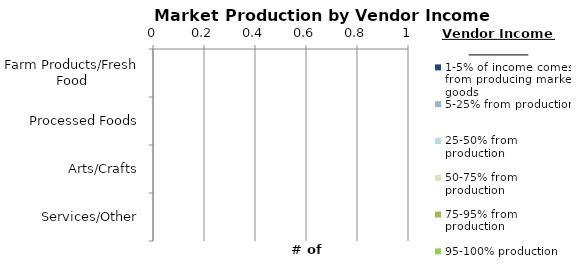
| Category | 1-5% of income comes from producing market goods | 5-25% from production | 25-50% from production | 50-75% from production | 75-95% from production | 95-100% production |
|---|---|---|---|---|---|---|
| Farm Products/Fresh Food | 0 | 0 | 0 | 0 | 0 | 0 |
| Processed Foods | 0 | 0 | 0 | 0 | 0 | 0 |
| Arts/Crafts | 0 | 0 | 0 | 0 | 0 | 0 |
| Services/Other | 0 | 0 | 0 | 0 | 0 | 0 |